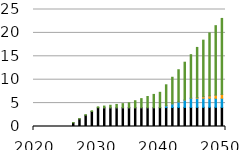
| Category | biomass | coal | natural gas | resid | waste | wind |
|---|---|---|---|---|---|---|
| 2020.0 | 0 | 0 | 0 | 0 | 0 | 0 |
| 2021.0 | 0 | 0 | 0 | 0 | 0 | 0 |
| 2022.0 | 0 | 0 | 0 | 0 | 0 | 0 |
| 2023.0 | 0 | 0 | 0 | 0 | 0 | 0 |
| 2024.0 | 0 | 0 | 0 | 0 | 0 | 0 |
| 2025.0 | 0 | 0 | 0 | 0 | 0 | 0 |
| 2026.0 | 0 | 0.803 | 0 | 0 | 0 | 0.036 |
| 2027.0 | 0 | 1.606 | 0 | 0 | 0 | 0.072 |
| 2028.0 | 0 | 2.409 | 0 | 0 | 0 | 0.108 |
| 2029.0 | 0 | 3.212 | 0 | 0 | 0 | 0.144 |
| 2030.0 | 0 | 4.015 | 0 | 0 | 0 | 0.18 |
| 2031.0 | 0 | 4.015 | 0 | 0 | 0.001 | 0.352 |
| 2032.0 | 0 | 4.015 | 0 | 0 | 0.001 | 0.525 |
| 2033.0 | 0 | 4.015 | 0 | 0 | 0.002 | 0.697 |
| 2034.0 | 0 | 4.015 | 0 | 0 | 0.002 | 0.87 |
| 2035.0 | 0 | 4.015 | 0 | 0 | 0.003 | 1.042 |
| 2036.0 | 0.003 | 4.015 | 0 | 0 | 0.002 | 1.489 |
| 2037.0 | 0.006 | 4.015 | 0 | 0 | 0.002 | 1.936 |
| 2038.0 | 0.008 | 4.015 | 0 | 0 | 0.001 | 2.382 |
| 2039.0 | 0.011 | 4.015 | 0 | 0 | 0.001 | 2.829 |
| 2040.0 | 0.014 | 4.015 | 0 | 0 | 0 | 3.276 |
| 2041.0 | 0.027 | 4.015 | 0.388 | 0 | 0 | 4.483 |
| 2042.0 | 0.04 | 4.015 | 0.777 | 0 | 0.001 | 5.689 |
| 2043.0 | 0.054 | 4.015 | 1.165 | 0 | 0.001 | 6.896 |
| 2044.0 | 0.067 | 4.015 | 1.553 | 0 | 0.002 | 8.102 |
| 2045.0 | 0.08 | 4.015 | 1.941 | 0 | 0.002 | 9.309 |
| 2046.0 | 0.08 | 4.015 | 1.941 | 0.165 | 0.002 | 10.693 |
| 2047.0 | 0.08 | 4.015 | 1.941 | 0.33 | 0.001 | 12.078 |
| 2048.0 | 0.08 | 4.015 | 1.941 | 0.495 | 0.001 | 13.462 |
| 2049.0 | 0.08 | 4.015 | 1.941 | 0.661 | 0 | 14.847 |
| 2050.0 | 0.08 | 4.015 | 1.941 | 0.826 | 0 | 16.232 |